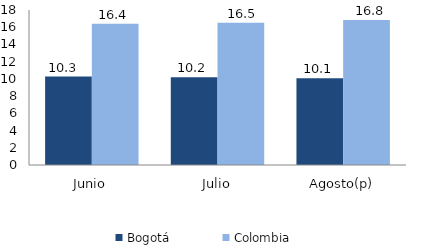
| Category | Bogotá | Colombia |
|---|---|---|
| Junio | 10.274 | 16.396 |
| Julio | 10.19 | 16.519 |
| Agosto(p) | 10.078 | 16.836 |